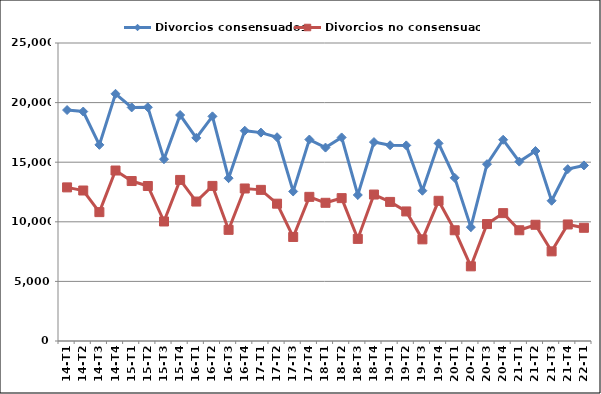
| Category | Divorcios consensuados | Divorcios no consensuados |
|---|---|---|
| 14-T1 | 19376 | 12887 |
| 14-T2 | 19251 | 12625 |
| 14-T3 | 16454 | 10812 |
| 14-T4 | 20739 | 14302 |
| 15-T1 | 19595 | 13420 |
| 15-T2 | 19612 | 13004 |
| 15-T3 | 15249 | 10027 |
| 15-T4 | 18958 | 13512 |
| 16-T1 | 17041 | 11699 |
| 16-T2 | 18847 | 13011 |
| 16-T3 | 13660 | 9325 |
| 16-T4 | 17641 | 12795 |
| 17-T1 | 17483 | 12679 |
| 17-T2 | 17095 | 11520 |
| 17-T3 | 12545 | 8727 |
| 17-T4 | 16901 | 12093 |
| 18-T1 | 16226 | 11594 |
| 18-T2 | 17077 | 11986 |
| 18-T3 | 12249 | 8566 |
| 18-T4 | 16689 | 12287 |
| 19-T1 | 16423 | 11668 |
| 19-T2 | 16409 | 10869 |
| 19-T3 | 12607 | 8528 |
| 19-T4 | 16581 | 11761 |
| 20-T1 | 13690 | 9290 |
| 20-T2 | 9552 | 6264 |
| 20-T3 | 14835 | 9809 |
| 20-T4 | 16883 | 10727 |
| 21-T1 | 15048 | 9290 |
| 21-T2 | 15937 | 9750 |
| 21-T3 | 11767 | 7520 |
| 21-T4 | 14416 | 9777 |
| 22-T1 | 14730 | 9498 |